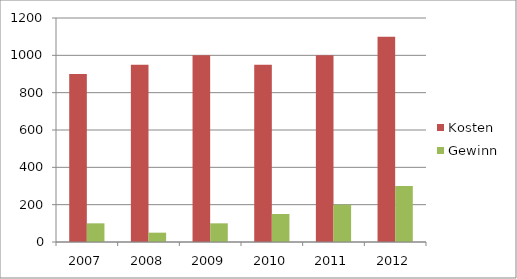
| Category | Kosten | Gewinn |
|---|---|---|
| 2007.0 | 900 | 100 |
| 2008.0 | 950 | 50 |
| 2009.0 | 1000 | 100 |
| 2010.0 | 950 | 150 |
| 2011.0 | 1000 | 200 |
| 2012.0 | 1100 | 300 |